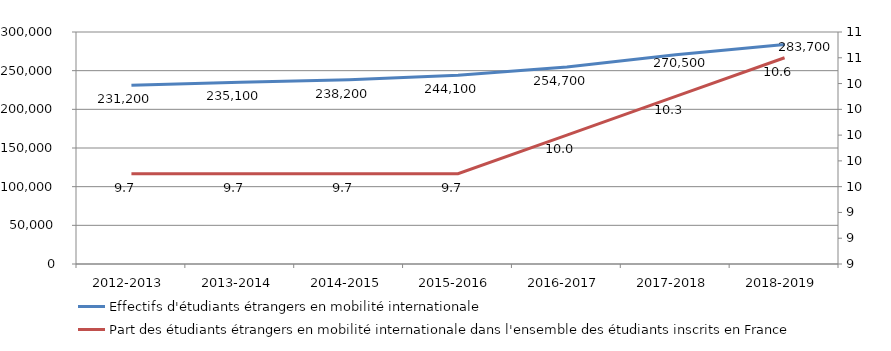
| Category | Effectifs d'étudiants étrangers en mobilité internationale |
|---|---|
| 2012-2013 | 231200 |
| 2013-2014 | 235100 |
| 2014-2015 | 238200 |
| 2015-2016 | 244100 |
| 2016-2017 | 254700 |
| 2017-2018 | 270500 |
| 2018-2019 | 283700 |